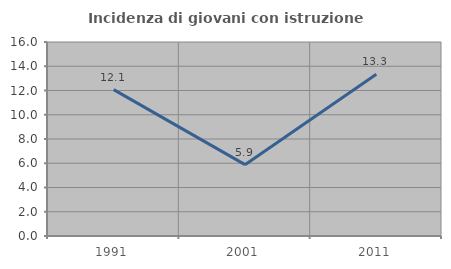
| Category | Incidenza di giovani con istruzione universitaria |
|---|---|
| 1991.0 | 12.069 |
| 2001.0 | 5.882 |
| 2011.0 | 13.333 |